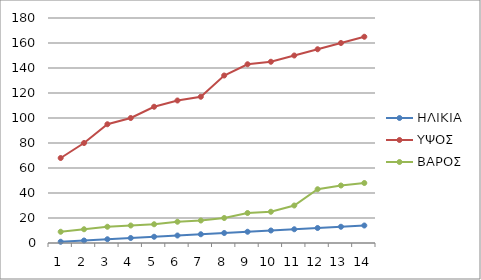
| Category | ΗΛΙΚΙΑ | ΥΨΟΣ | ΒΑΡΟΣ |
|---|---|---|---|
| 0 | 1 | 68 | 9 |
| 1 | 2 | 80 | 11 |
| 2 | 3 | 95 | 13 |
| 3 | 4 | 100 | 14 |
| 4 | 5 | 109 | 15 |
| 5 | 6 | 114 | 17 |
| 6 | 7 | 117 | 18 |
| 7 | 8 | 134 | 20 |
| 8 | 9 | 143 | 24 |
| 9 | 10 | 145 | 25 |
| 10 | 11 | 150 | 30 |
| 11 | 12 | 155 | 43 |
| 12 | 13 | 160 | 46 |
| 13 | 14 | 165 | 48 |